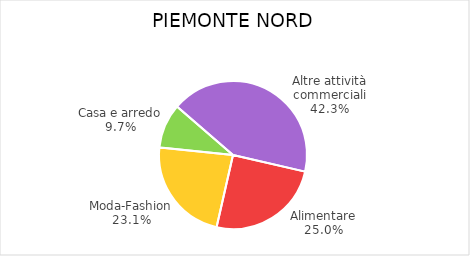
| Category | Piemonte Nord |
|---|---|
| Alimentare | 3095 |
| Moda-Fashion | 2862 |
| Casa e arredo | 1204 |
| Altre attività commerciali | 5243 |